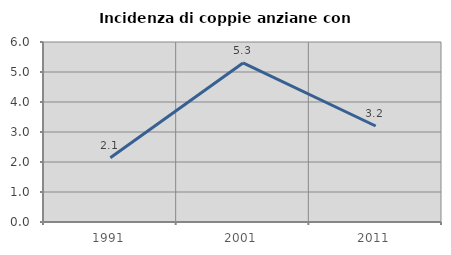
| Category | Incidenza di coppie anziane con figli |
|---|---|
| 1991.0 | 2.143 |
| 2001.0 | 5.303 |
| 2011.0 | 3.2 |